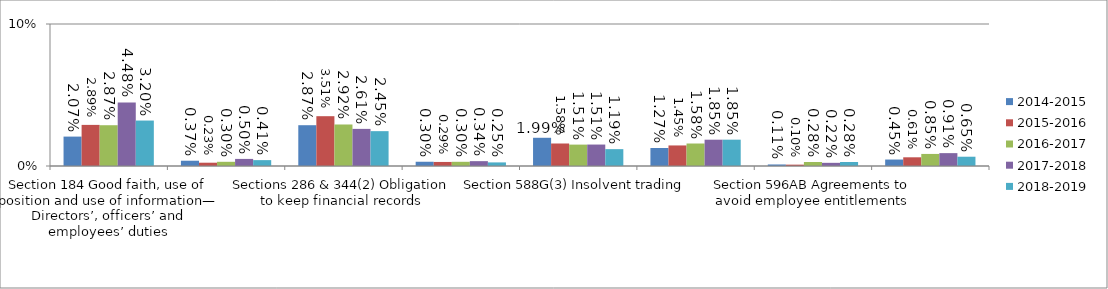
| Category | 2014-2015 | 2015-2016 | 2016-2017 | 2017-2018 | 2018-2019 |
|---|---|---|---|---|---|
| Section 184 Good faith, use of position and use of information—
Directors’, officers’ and employees’ duties | 0.021 | 0.029 | 0.029 | 0.045 | 0.032 |
| Section 206A Disqualified persons not to manage corporations | 0.004 | 0.002 | 0.003 | 0.005 | 0.004 |
| Sections 286 & 344(2) Obligation to keep financial records | 0.029 | 0.035 | 0.029 | 0.026 | 0.025 |
| Section 471A Powers of other officers suspended during winding up | 0.003 | 0.003 | 0.003 | 0.003 | 0.003 |
| Section 588G(3) Insolvent trading | 0.02 | 0.016 | 0.015 | 0.015 | 0.012 |
| Section 590 Offences by officers or employees | 0.013 | 0.014 | 0.016 | 0.019 | 0.019 |
| Section 596AB Agreements to avoid employee entitlements | 0.001 | 0.001 | 0.003 | 0.002 | 0.003 |
| Other criminal offences under the Corporations Act | 0.005 | 0.006 | 0.008 | 0.009 | 0.007 |